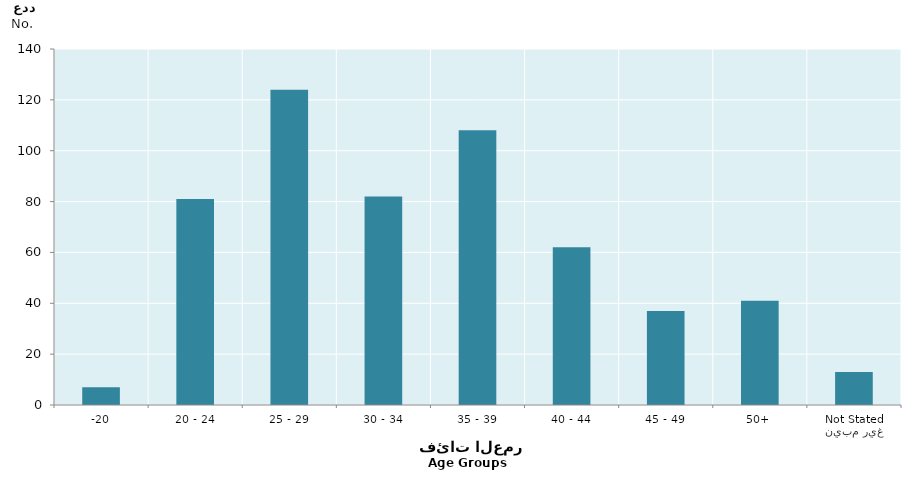
| Category | Series 0 |
|---|---|
| -20 | 7 |
| 20 - 24 | 81 |
| 25 - 29 | 124 |
| 30 - 34 | 82 |
| 35 - 39 | 108 |
| 40 - 44 | 62 |
| 45 - 49 | 37 |
| 50+ | 41 |
| غير مبين
Not Stated | 13 |